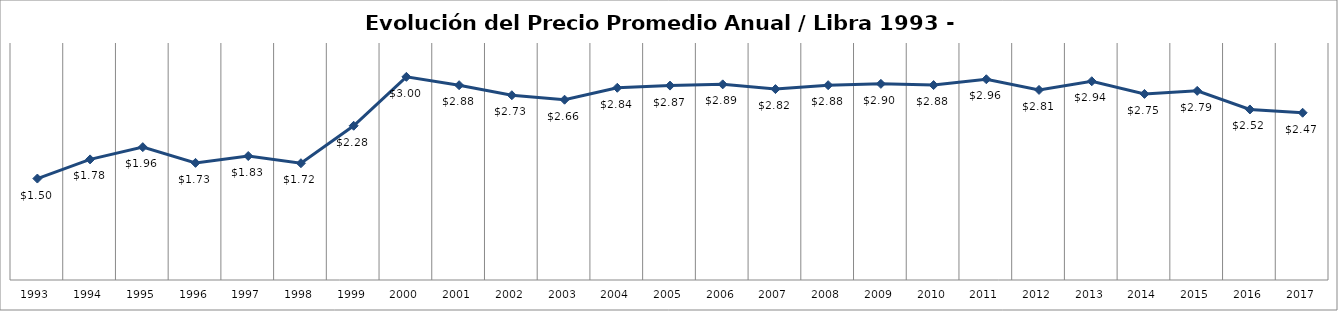
| Category | Series 0 |
|---|---|
| 1993.0 | 1.498 |
| 1994.0 | 1.781 |
| 1995.0 | 1.962 |
| 1996.0 | 1.73 |
| 1997.0 | 1.831 |
| 1998.0 | 1.725 |
| 1999.0 | 2.278 |
| 2000.0 | 3 |
| 2001.0 | 2.877 |
| 2002.0 | 2.728 |
| 2003.0 | 2.662 |
| 2004.0 | 2.839 |
| 2005.0 | 2.871 |
| 2006.0 | 2.889 |
| 2007.0 | 2.819 |
| 2008.0 | 2.877 |
| 2009.0 | 2.896 |
| 2010.0 | 2.879 |
| 2011.0 | 2.965 |
| 2012.0 | 2.807 |
| 2013.0 | 2.935 |
| 2014.0 | 2.748 |
| 2015.0 | 2.793 |
| 2016.0 | 2.519 |
| 2017.0 | 2.47 |